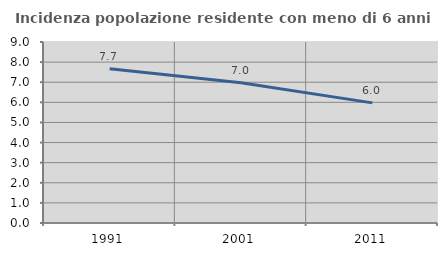
| Category | Incidenza popolazione residente con meno di 6 anni |
|---|---|
| 1991.0 | 7.67 |
| 2001.0 | 6.978 |
| 2011.0 | 5.972 |